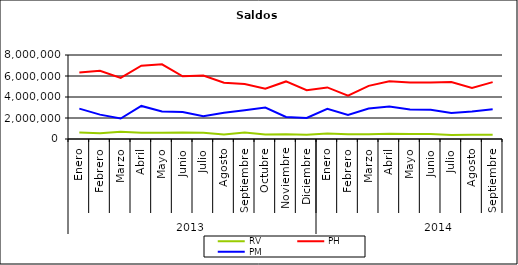
| Category | RV | PH | PM |
|---|---|---|---|
| 0 | 625726.624 | 6338490.057 | 2894951.851 |
| 1 | 552164.14 | 6505711.807 | 2320902.81 |
| 2 | 684317.675 | 5822855.149 | 1948127.804 |
| 3 | 601474.166 | 6976391.987 | 3151453.143 |
| 4 | 590050.657 | 7107878.906 | 2620515.735 |
| 5 | 624993.58 | 5975534.656 | 2574055.31 |
| 6 | 600696.535 | 6050025.472 | 2173848.831 |
| 7 | 419012.816 | 5367684.924 | 2503871.717 |
| 8 | 611730.758 | 5247250.768 | 2727549.288 |
| 9 | 419155.215 | 4784420.625 | 2990459.774 |
| 10 | 447319.577 | 5481772.72 | 2092491.866 |
| 11 | 408611.698 | 4646492.747 | 1999878.157 |
| 12 | 527889.485 | 4912075.273 | 2877652.76 |
| 13 | 454567.098 | 4120538.063 | 2278357.683 |
| 14 | 451499.2 | 5057360.029 | 2895505.472 |
| 15 | 496328.639 | 5498657.25 | 3083378.882 |
| 16 | 484463.452 | 5384146.137 | 2812191.042 |
| 17 | 465266.869 | 5373295.415 | 2775261.669 |
| 18 | 390003.439 | 5435984.925 | 2470327.976 |
| 19 | 403145.138 | 4872387.208 | 2622344.549 |
| 20 | 394930.475 | 5416500.478 | 2826484.554 |